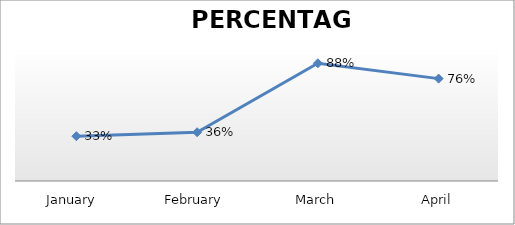
| Category | PERCENTAGE |
|---|---|
| January  | 0.334 |
| February | 0.364 |
| March | 0.878 |
| April | 0.764 |